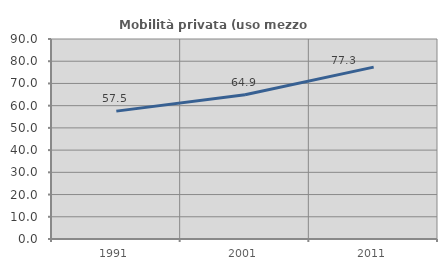
| Category | Mobilità privata (uso mezzo privato) |
|---|---|
| 1991.0 | 57.543 |
| 2001.0 | 64.93 |
| 2011.0 | 77.331 |